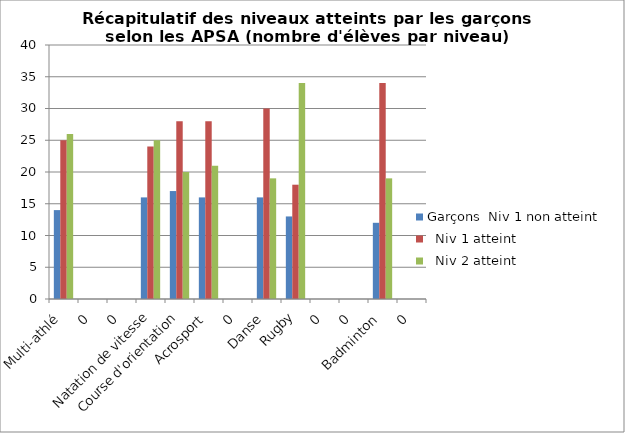
| Category | Garçons Niv 1 non atteint | Garçons Niv 1 atteint | Garçons Niv 2 atteint |
|---|---|---|---|
| Multi-athlé | 14 | 25 | 26 |
| 0 | 0 | 0 | 0 |
| 0 | 0 | 0 | 0 |
| Natation de vitesse | 16 | 24 | 25 |
| Course d'orientation | 17 | 28 | 20 |
| Acrosport | 16 | 28 | 21 |
| 0 | 0 | 0 | 0 |
| Danse | 16 | 30 | 19 |
| Rugby | 13 | 18 | 34 |
| 0 | 0 | 0 | 0 |
| 0 | 0 | 0 | 0 |
| Badminton | 12 | 34 | 19 |
| 0 | 0 | 0 | 0 |